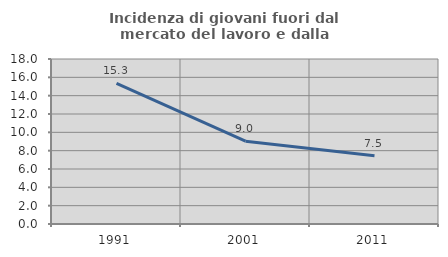
| Category | Incidenza di giovani fuori dal mercato del lavoro e dalla formazione  |
|---|---|
| 1991.0 | 15.349 |
| 2001.0 | 9.04 |
| 2011.0 | 7.456 |